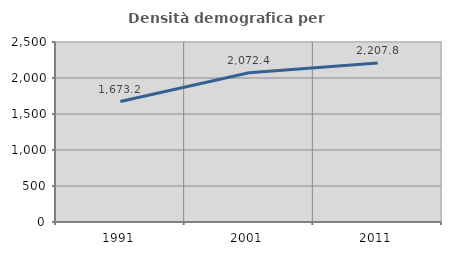
| Category | Densità demografica |
|---|---|
| 1991.0 | 1673.164 |
| 2001.0 | 2072.358 |
| 2011.0 | 2207.811 |